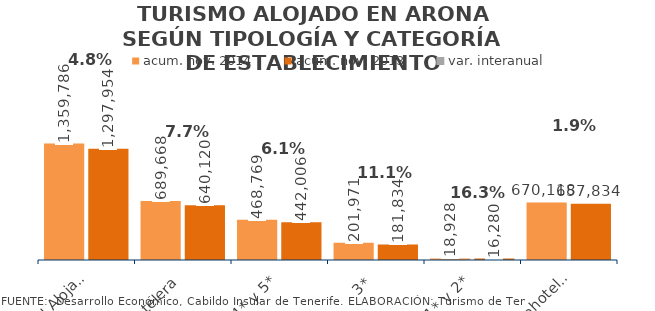
| Category | acum. nov. 2014 | acum. nov. 2013 |
|---|---|---|
| Total Alojados | 1359786 | 1297954 |
| Hotelera | 689668 | 640120 |
| 4* y 5* | 468769 | 442006 |
| 3* | 201971 | 181834 |
| 1* y 2* | 18928 | 16280 |
| Extrahotelera | 670118 | 657834 |